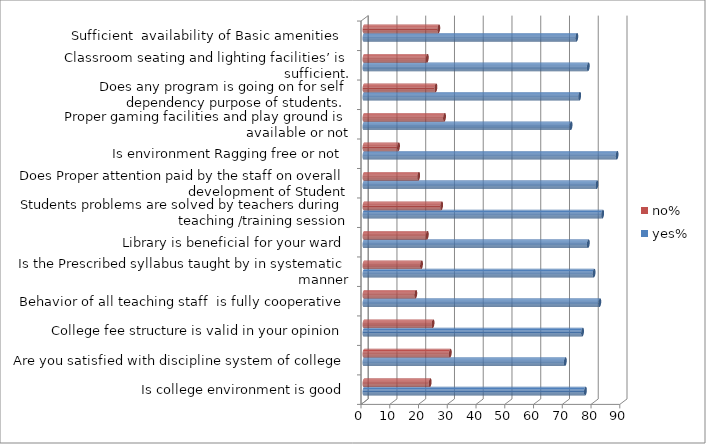
| Category | yes% | no% |
|---|---|---|
| Is college environment is good | 77 | 23 |
| Are you satisfied with discipline system of college | 70 | 30 |
| College fee structure is valid in your opinion | 76 | 24 |
| Behavior of all teaching staff  is fully cooperative | 82 | 18 |
| Is the Prescribed syllabus taught by in systematic manner | 80 | 20 |
| Library is beneficial for your ward | 78 | 22 |
| Students problems are solved by teachers during teaching /training session | 83 | 27 |
| Does Proper attention paid by the staff on overall development of Student | 81 | 19 |
| Is environment Ragging free or not | 88 | 12 |
| Proper gaming facilities and play ground is available or not | 72 | 28 |
| Does any program is going on for self dependency purpose of students. | 75 | 25 |
| Classroom seating and lighting facilities’ is sufficient. | 78 | 22 |
| Sufficient  availability of Basic amenities  | 74 | 26 |